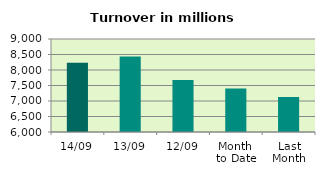
| Category | Series 0 |
|---|---|
| 14/09 | 8235.856 |
| 13/09 | 8433.314 |
| 12/09 | 7681.232 |
| Month 
to Date | 7405.823 |
| Last
Month | 7128.729 |